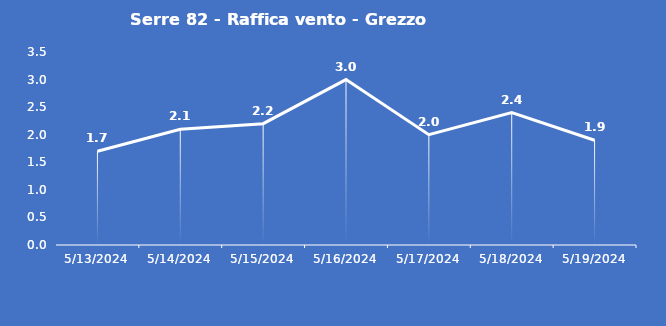
| Category | Serre 82 - Raffica vento - Grezzo (m/s) |
|---|---|
| 5/13/24 | 1.7 |
| 5/14/24 | 2.1 |
| 5/15/24 | 2.2 |
| 5/16/24 | 3 |
| 5/17/24 | 2 |
| 5/18/24 | 2.4 |
| 5/19/24 | 1.9 |